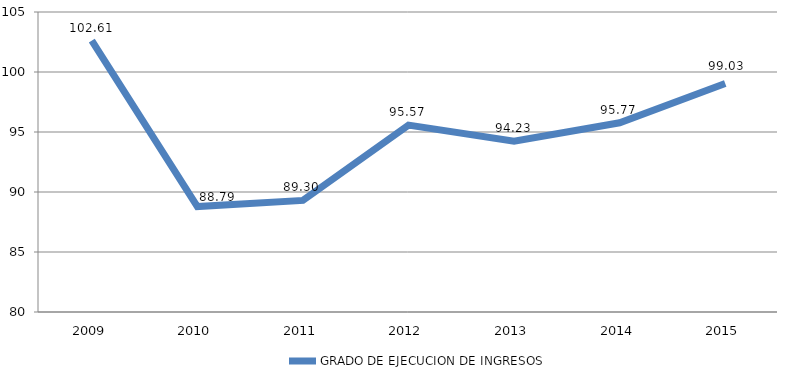
| Category | GRADO DE EJECUCION DE INGRESOS |
|---|---|
| 2009.0 | 102.614 |
| 2010.0 | 88.789 |
| 2011.0 | 89.299 |
| 2012.0 | 95.572 |
| 2013.0 | 94.229 |
| 2014.0 | 95.768 |
| 2015.0 | 99.035 |